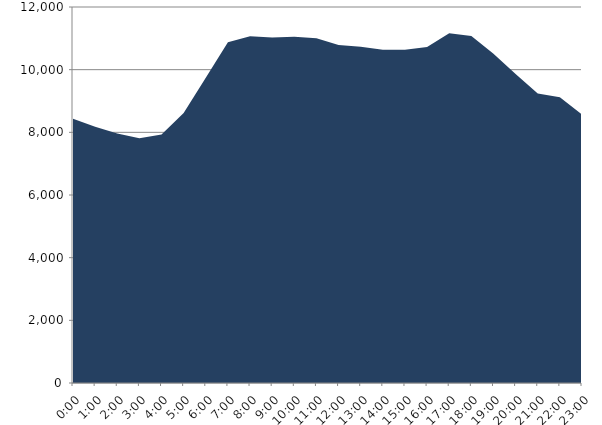
| Category | Series 0 | Series 1 |
|---|---|---|
| 2016-01-20 |  | 8431.202 |
| 2016-01-20 01:00:00 |  | 8181.426 |
| 2016-01-20 02:00:00 |  | 7958.846 |
| 2016-01-20 03:00:00 |  | 7808.012 |
| 2016-01-20 04:00:00 |  | 7930.466 |
| 2016-01-20 05:00:00 |  | 8615.073 |
| 2016-01-20 06:00:00 |  | 9745.55 |
| 2016-01-20 07:00:00 |  | 10873.518 |
| 2016-01-20 08:00:00 |  | 11068.105 |
| 2016-01-20 09:00:00 |  | 11029.065 |
| 2016-01-20 10:00:00 |  | 11053.088 |
| 2016-01-20 11:00:00 |  | 11003.163 |
| 2016-01-20 12:00:00 |  | 10788.757 |
| 2016-01-20 13:00:00 |  | 10728.058 |
| 2016-01-20 14:00:00 |  | 10637.912 |
| 2016-01-20 15:00:00 |  | 10634.43 |
| 2016-01-20 16:00:00 |  | 10725.472 |
| 2016-01-20 17:00:00 |  | 11162.694 |
| 2016-01-20 18:00:00 |  | 11075.972 |
| 2016-01-20 19:00:00 |  | 10504.611 |
| 2016-01-20 20:00:00 |  | 9864.57 |
| 2016-01-20 21:00:00 |  | 9239.894 |
| 2016-01-20 22:00:00 |  | 9121.116 |
| 2016-01-20 23:00:00 |  | 8567.912 |